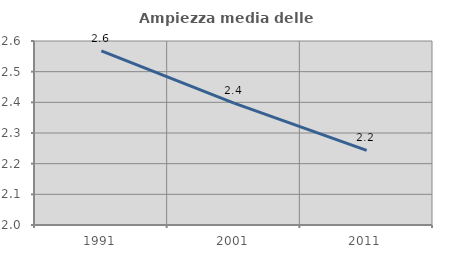
| Category | Ampiezza media delle famiglie |
|---|---|
| 1991.0 | 2.568 |
| 2001.0 | 2.397 |
| 2011.0 | 2.243 |